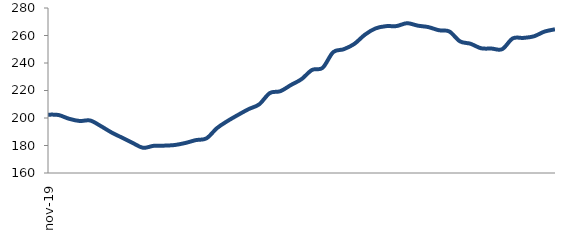
| Category | Series 0 |
|---|---|
| 2019-11-01 | 202.424 |
| 2019-12-01 | 202.177 |
| 2020-01-01 | 199.409 |
| 2020-02-01 | 197.826 |
| 2020-03-01 | 198.161 |
| 2020-04-01 | 194.123 |
| 2020-05-01 | 189.538 |
| 2020-06-01 | 185.731 |
| 2020-07-01 | 181.914 |
| 2020-08-01 | 178.343 |
| 2020-09-01 | 179.758 |
| 2020-10-01 | 179.9 |
| 2020-11-01 | 180.346 |
| 2020-12-01 | 181.827 |
| 2021-01-01 | 183.909 |
| 2021-02-01 | 185.191 |
| 2021-03-01 | 192.66 |
| 2021-04-01 | 197.814 |
| 2021-05-01 | 202.28 |
| 2021-06-01 | 206.474 |
| 2021-07-01 | 209.951 |
| 2021-08-01 | 218.146 |
| 2021-09-01 | 219.495 |
| 2021-10-01 | 224.001 |
| 2021-11-01 | 228.234 |
| 2021-12-01 | 234.966 |
| 2022-01-01 | 236.495 |
| 2022-02-01 | 247.883 |
| 2022-03-01 | 250.016 |
| 2022-04-01 | 253.872 |
| 2022-05-01 | 260.574 |
| 2022-06-01 | 265.125 |
| 2022-07-01 | 266.79 |
| 2022-08-01 | 266.867 |
| 2022-09-01 | 268.948 |
| 2022-10-01 | 267.186 |
| 2022-11-01 | 266.12 |
| 2022-12-01 | 263.849 |
| 2023-01-01 | 262.911 |
| 2023-02-01 | 255.756 |
| 2023-03-01 | 253.995 |
| 2023-04-01 | 250.72 |
| 2023-05-01 | 250.501 |
| 2023-06-01 | 250.068 |
| 2023-07-01 | 257.894 |
| 2023-08-01 | 258.252 |
| 2023-09-01 | 259.395 |
| 2023-10-01 | 262.829 |
| 2023-11-01 | 264.52 |